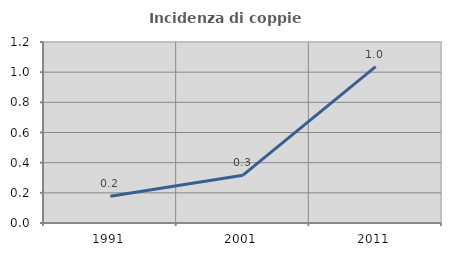
| Category | Incidenza di coppie miste |
|---|---|
| 1991.0 | 0.177 |
| 2001.0 | 0.317 |
| 2011.0 | 1.036 |